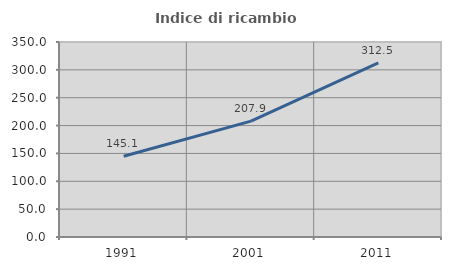
| Category | Indice di ricambio occupazionale  |
|---|---|
| 1991.0 | 145.055 |
| 2001.0 | 207.921 |
| 2011.0 | 312.5 |